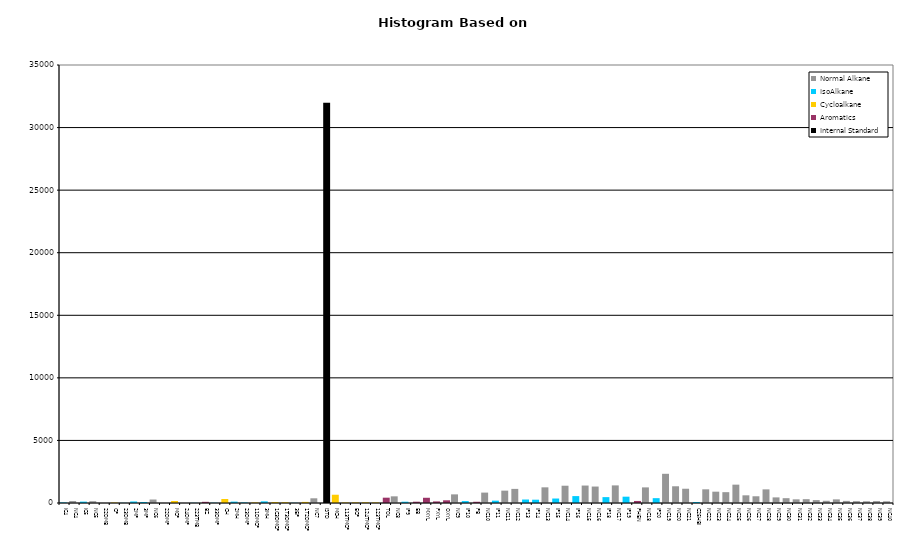
| Category | Normal Alkane | IsoAlkane | Cycloalkane | Aromatics | Internal Standard |
|---|---|---|---|---|---|
| IC4 | 0 | 42 | 0 | 0 | 0 |
| NC4 | 156 | 0 | 0 | 0 | 0 |
| IC5 | 0 | 110 | 0 | 0 | 0 |
| NC5 | 145 | 0 | 0 | 0 | 0 |
| 22DMB | 0 | 0 | 0 | 0 | 0 |
| CP | 0 | 0 | 34 | 0 | 0 |
| 23DMB | 0 | 13 | 0 | 0 | 0 |
| 2MP | 0 | 122 | 0 | 0 | 0 |
| 3MP | 0 | 80 | 0 | 0 | 0 |
| NC6 | 278 | 0 | 0 | 0 | 0 |
| 22DMP | 0 | 0 | 0 | 0 | 0 |
| MCP | 0 | 0 | 162 | 0 | 0 |
| 24DMP | 0 | 0 | 0 | 0 | 0 |
| 223TMB | 0 | 15 | 0 | 0 | 0 |
| BZ | 0 | 0 | 0 | 94 | 0 |
| 33DMP | 0 | 20 | 0 | 0 | 0 |
| CH | 0 | 0 | 321 | 0 | 0 |
| 2MH | 0 | 110 | 0 | 0 | 0 |
| 23DMP | 0 | 43 | 0 | 0 | 0 |
| 11DMCP | 0 | 0 | 45 | 0 | 0 |
| 3MH | 0 | 132 | 0 | 0 | 0 |
| 1C3DMCP | 0 | 0 | 77 | 0 | 0 |
| 1T3DMCP | 0 | 0 | 63 | 0 | 0 |
| 3EP | 0 | 15 | 0 | 0 | 0 |
| 1T2DMCP | 0 | 0 | 88 | 0 | 0 |
| NC7 | 376 | 0 | 0 | 0 | 0 |
| ISTD | 0 | 0 | 0 | 0 | 31975 |
| MCH | 0 | 0 | 660 | 0 | 0 |
| 113TMCP | 0 | 0 | 42 | 0 | 0 |
| ECP | 0 | 0 | 50 | 0 | 0 |
| 124TMCP | 0 | 0 | 57 | 0 | 0 |
| 123TMCP | 0 | 0 | 45 | 0 | 0 |
| TOL | 0 | 0 | 0 | 425 | 0 |
| NC8 | 533 | 0 | 0 | 0 | 0 |
| IP9 | 0 | 104 | 0 | 0 | 0 |
| EB | 0 | 0 | 0 | 104 | 0 |
| MXYL | 0 | 0 | 0 | 418 | 0 |
| PXYL | 0 | 0 | 0 | 127 | 0 |
| OXYL | 0 | 0 | 0 | 216 | 0 |
| NC9 | 690 | 0 | 0 | 0 | 0 |
| IP10 | 0 | 153 | 0 | 0 | 0 |
| PB | 0 | 0 | 0 | 99 | 0 |
| NC10 | 831 | 0 | 0 | 0 | 0 |
| IP11 | 0 | 188 | 0 | 0 | 0 |
| NC11 | 988 | 0 | 0 | 0 | 0 |
| NC12 | 1128 | 0 | 0 | 0 | 0 |
| IP13 | 0 | 278 | 0 | 0 | 0 |
| IP14 | 0 | 264 | 0 | 0 | 0 |
| NC13 | 1252 | 0 | 0 | 0 | 0 |
| IP15 | 0 | 358 | 0 | 0 | 0 |
| NC14 | 1381 | 0 | 0 | 0 | 0 |
| IP16 | 0 | 552 | 0 | 0 | 0 |
| NC15 | 1395 | 0 | 0 | 0 | 0 |
| NC16 | 1315 | 0 | 0 | 0 | 0 |
| IP18 | 0 | 470 | 0 | 0 | 0 |
| NC17 | 1407 | 0 | 0 | 0 | 0 |
| IP19 | 0 | 505 | 0 | 0 | 0 |
| PHEN | 0 | 0 | 0 | 163 | 0 |
| NC18 | 1248 | 0 | 0 | 0 | 0 |
| IP20 | 0 | 387 | 0 | 0 | 0 |
| NC19 | 2333 | 0 | 0 | 0 | 0 |
| NC20 | 1337 | 0 | 0 | 0 | 0 |
| NC21 | 1140 | 0 | 0 | 0 | 0 |
| C25HBI | 0 | 78 | 0 | 0 | 0 |
| NC22 | 1093 | 0 | 0 | 0 | 0 |
| NC23 | 905 | 0 | 0 | 0 | 0 |
| NC24 | 866 | 0 | 0 | 0 | 0 |
| NC25 | 1466 | 0 | 0 | 0 | 0 |
| NC26 | 614 | 0 | 0 | 0 | 0 |
| NC27 | 538 | 0 | 0 | 0 | 0 |
| NC28 | 1089 | 0 | 0 | 0 | 0 |
| NC29 | 448 | 0 | 0 | 0 | 0 |
| NC30 | 385 | 0 | 0 | 0 | 0 |
| NC31 | 293 | 0 | 0 | 0 | 0 |
| NC32 | 306 | 0 | 0 | 0 | 0 |
| NC33 | 231 | 0 | 0 | 0 | 0 |
| NC34 | 177 | 0 | 0 | 0 | 0 |
| NC35 | 290 | 0 | 0 | 0 | 0 |
| NC36 | 168 | 0 | 0 | 0 | 0 |
| NC37 | 148 | 0 | 0 | 0 | 0 |
| NC38 | 139 | 0 | 0 | 0 | 0 |
| NC39 | 154 | 0 | 0 | 0 | 0 |
| NC40 | 138 | 0 | 0 | 0 | 0 |